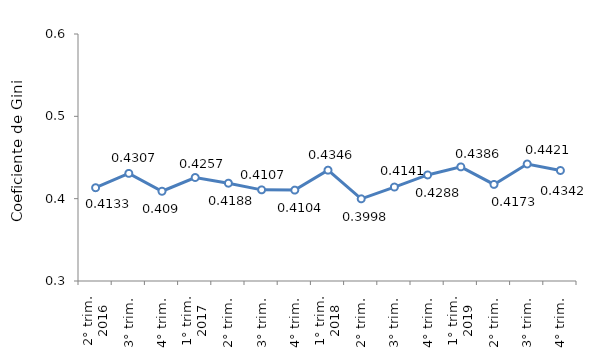
| Category | 2° trim. 3° trim. 4° trim. 1° trim. 2° trim. 3° trim. 4° trim. 1° trim. 2° trim. 3° trim. 4° trim. 1° trim. 2° trim. 3° trim. 4° trim. |
|---|---|
| 0 | 0.413 |
| 1 | 0.431 |
| 2 | 0.409 |
| 3 | 0.426 |
| 4 | 0.419 |
| 5 | 0.411 |
| 6 | 0.41 |
| 7 | 0.435 |
| 8 | 0.4 |
| 9 | 0.414 |
| 10 | 0.429 |
| 11 | 0.439 |
| 12 | 0.417 |
| 13 | 0.442 |
| 14 | 0.434 |